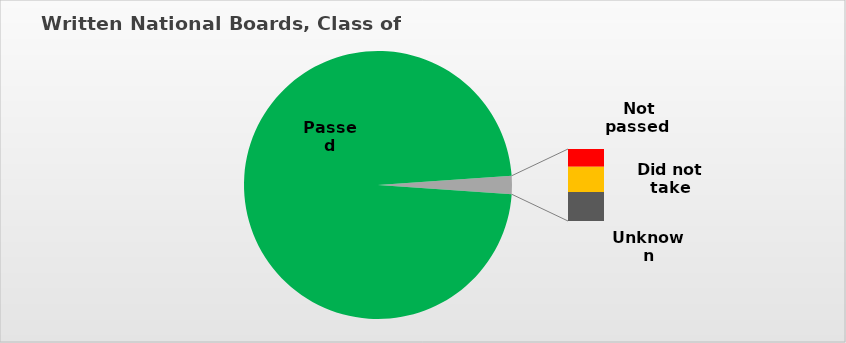
| Category | Series 0 |
|---|---|
| Passed | 0.978 |
| Not passed  | 0.005 |
| Did not take | 0.008 |
| Unknown | 0.009 |